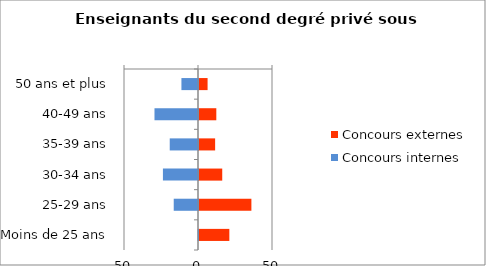
| Category | Concours externes | Concours internes |
|---|---|---|
| 50 ans et plus | 5.8 | -11.2 |
| 40-49 ans | 11.7 | -29.4 |
| 35-39 ans | 10.9 | -19.1 |
| 30-34 ans | 15.7 | -23.7 |
| 25-29 ans | 35.4 | -16.4 |
| Moins de 25 ans | 20.5 | -0.2 |